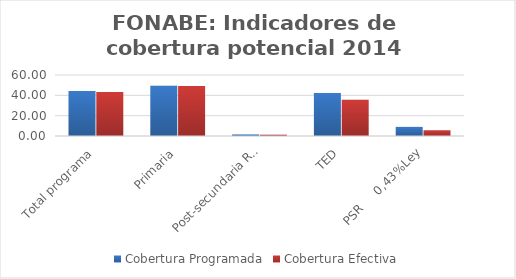
| Category | Cobertura Programada | Cobertura Efectiva |
|---|---|---|
| Total programa | 44.274 | 43.314 |
| Primaria | 49.479 | 49.168 |
| Post-secundaria Regular | 1.557 | 1.272 |
| TED | 42.31 | 35.65 |
| PSR     0,43%Ley | 8.958 | 5.659 |